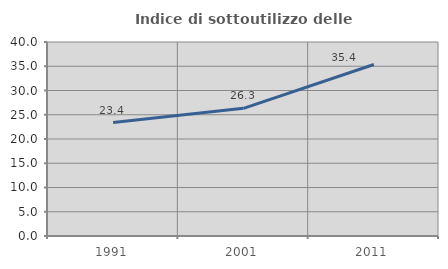
| Category | Indice di sottoutilizzo delle abitazioni  |
|---|---|
| 1991.0 | 23.379 |
| 2001.0 | 26.322 |
| 2011.0 | 35.356 |